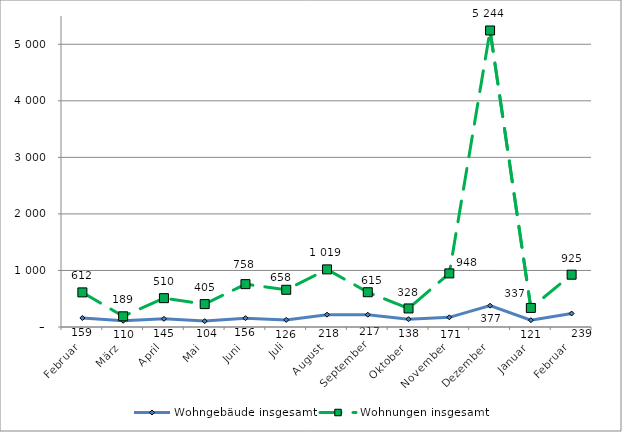
| Category | Wohngebäude insgesamt | Wohnungen insgesamt |
|---|---|---|
| Februar | 159 | 612 |
| März | 110 | 189 |
| April | 145 | 510 |
| Mai | 104 | 405 |
| Juni | 156 | 758 |
| Juli | 126 | 658 |
| August | 218 | 1019 |
| September | 217 | 615 |
| Oktober | 138 | 328 |
| November | 171 | 948 |
| Dezember | 377 | 5244 |
| Januar | 121 | 337 |
| Februar | 239 | 925 |